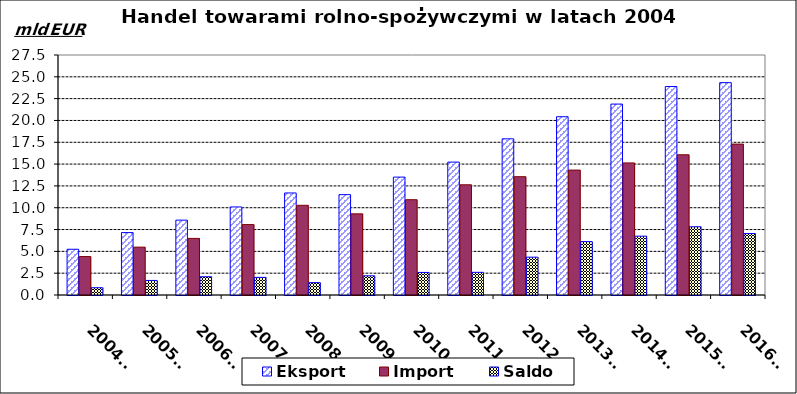
| Category | Eksport | Import | Saldo |
|---|---|---|---|
| 2004r. | 5.242 | 4.406 | 0.836 |
| 2005r. | 7.152 | 5.485 | 1.667 |
| 2006r. | 8.577 | 6.486 | 2.091 |
| 2007r. | 10.089 | 8.07 | 2.019 |
| 2008r. | 11.692 | 10.277 | 1.415 |
| 2009r. | 11.499 | 9.299 | 2.2 |
| 2010r. | 13.507 | 10.921 | 2.586 |
| 2011r. | 15.228 | 12.628 | 2.599 |
| 2012r. | 17.893 | 13.557 | 4.336 |
| 2013r. | 20.427 | 14.313 | 6.115 |
| 2014r. | 21.876 | 15.134 | 6.742 |
| 2015r. | 23.887 | 16.068 | 7.818 |
| 2016r. | 24.332 | 17.292 | 7.04 |